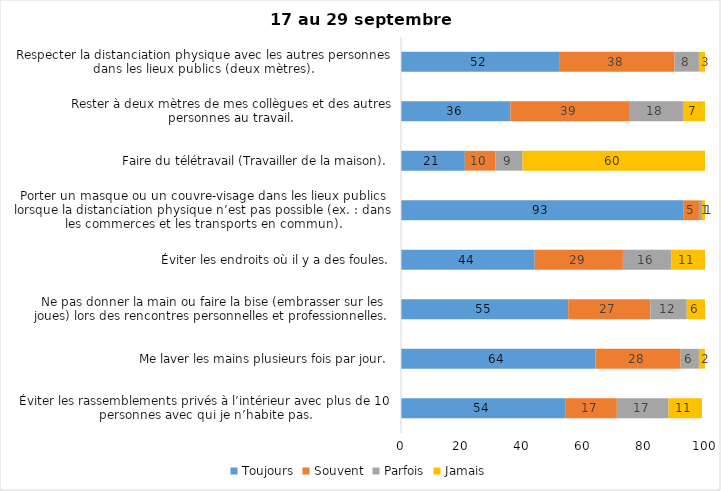
| Category | Toujours | Souvent | Parfois | Jamais |
|---|---|---|---|---|
| Éviter les rassemblements privés à l’intérieur avec plus de 10 personnes avec qui je n’habite pas. | 54 | 17 | 17 | 11 |
| Me laver les mains plusieurs fois par jour. | 64 | 28 | 6 | 2 |
| Ne pas donner la main ou faire la bise (embrasser sur les joues) lors des rencontres personnelles et professionnelles. | 55 | 27 | 12 | 6 |
| Éviter les endroits où il y a des foules. | 44 | 29 | 16 | 11 |
| Porter un masque ou un couvre-visage dans les lieux publics lorsque la distanciation physique n’est pas possible (ex. : dans les commerces et les transports en commun). | 93 | 5 | 1 | 1 |
| Faire du télétravail (Travailler de la maison). | 21 | 10 | 9 | 60 |
| Rester à deux mètres de mes collègues et des autres personnes au travail. | 36 | 39 | 18 | 7 |
| Respecter la distanciation physique avec les autres personnes dans les lieux publics (deux mètres). | 52 | 38 | 8 | 3 |